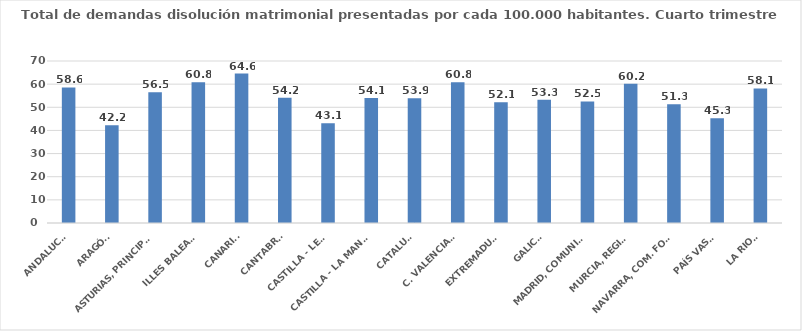
| Category | Series 0 |
|---|---|
| ANDALUCÍA | 58.557 |
| ARAGÓN | 42.222 |
| ASTURIAS, PRINCIPADO | 56.535 |
| ILLES BALEARS | 60.765 |
| CANARIAS | 64.564 |
| CANTABRIA | 54.151 |
| CASTILLA - LEÓN | 43.117 |
| CASTILLA - LA MANCHA | 54.059 |
| CATALUÑA | 53.897 |
| C. VALENCIANA | 60.828 |
| EXTREMADURA | 52.144 |
| GALICIA | 53.299 |
| MADRID, COMUNIDAD | 52.546 |
| MURCIA, REGIÓN | 60.188 |
| NAVARRA, COM. FORAL | 51.346 |
| PAÍS VASCO | 45.286 |
| LA RIOJA | 58.145 |